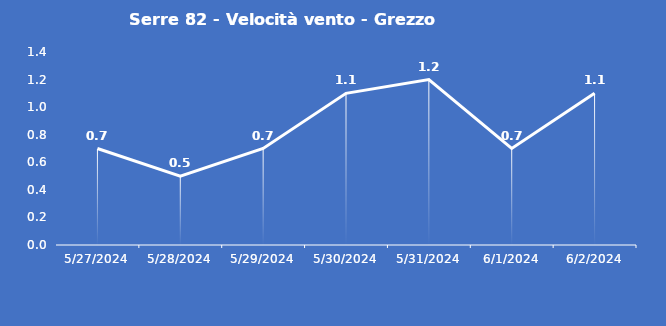
| Category | Serre 82 - Velocità vento - Grezzo (m/s) |
|---|---|
| 5/27/24 | 0.7 |
| 5/28/24 | 0.5 |
| 5/29/24 | 0.7 |
| 5/30/24 | 1.1 |
| 5/31/24 | 1.2 |
| 6/1/24 | 0.7 |
| 6/2/24 | 1.1 |